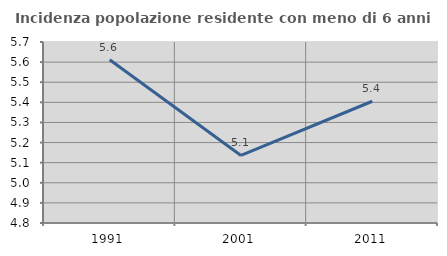
| Category | Incidenza popolazione residente con meno di 6 anni |
|---|---|
| 1991.0 | 5.612 |
| 2001.0 | 5.136 |
| 2011.0 | 5.405 |